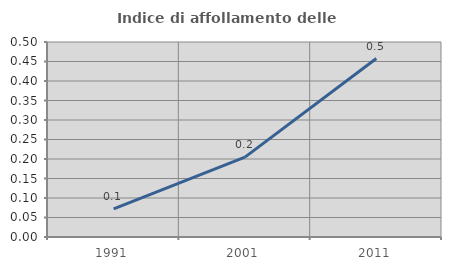
| Category | Indice di affollamento delle abitazioni  |
|---|---|
| 1991.0 | 0.072 |
| 2001.0 | 0.205 |
| 2011.0 | 0.458 |